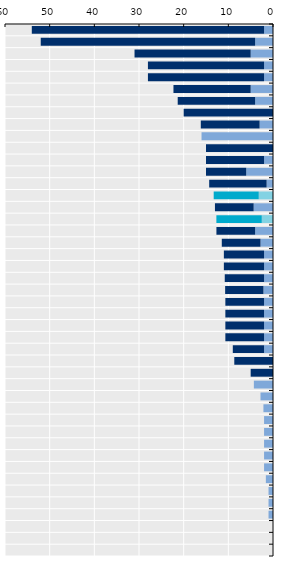
| Category | Series 0 | Series 1 |
|---|---|---|
| Korea | 2 | 52 |
| Japan | 4 | 48 |
| France | 5 | 26 |
| Luxembourg | 2 | 26 |
| Slovak Republic | 2 | 26 |
| Portugal | 5 | 17.286 |
| Belgium | 4 | 17.333 |
| Iceland | 0 | 20 |
| Finland | 3 | 13.166 |
| Spain | 16 | 0 |
| Norway | 0 | 15 |
| Italy | 2 | 13 |
| Netherlands | 6 | 9 |
| Sweden | 1.429 | 12.857 |
| EU average | 3.19 | 10.087 |
| Austria | 4.33 | 8.667 |
| OECD average | 2.51 | 10.167 |
| Lithuania | 4 | 8.666 |
| Greece | 2.8 | 8.667 |
| Poland | 2 | 9 |
| Denmark | 2 | 9 |
| Hungary | 2 | 8.8 |
| Slovenia | 2.143 | 8.571 |
| Croatia | 2 | 8.667 |
| Romania | 2 | 8.666 |
| Latvia | 2 | 8.666 |
| Malta | 2 | 8.666 |
| Ireland | 2 | 7 |
| Germany | 0 | 8.667 |
| Canada | 0 | 5 |
| Estonia | 4.286 | 0 |
| Colombia | 2.8 | 0 |
| Bulgaria | 2.143 | 0 |
| Cyprus | 2 | 0 |
| Australia | 2 | 0 |
| United Kingdom | 2 | 0 |
| Switzerland | 2 | 0 |
| Czechia | 2 | 0 |
| Costa Rica | 1.6 | 0 |
| Türkiye | 1 | 0 |
| Mexico | 1 | 0 |
| Chile | 1 | 0 |
| New Zealand | 0 | 0 |
| Israel | 0 | 0 |